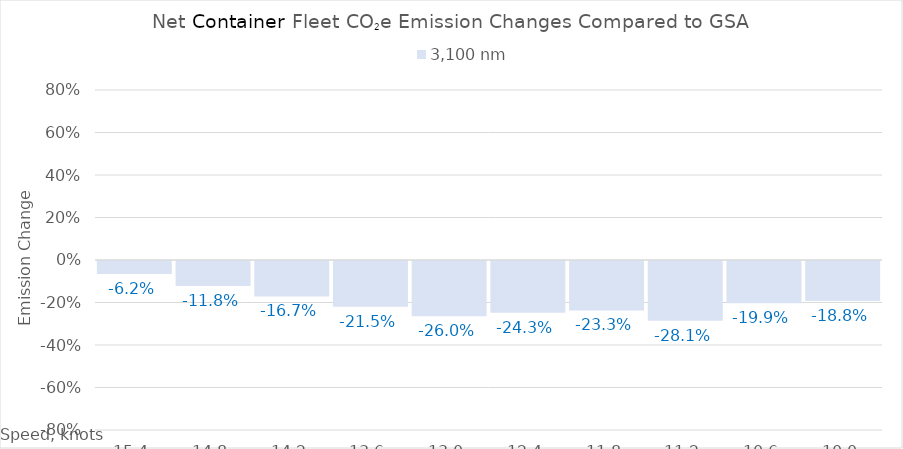
| Category | 3,100 |
|---|---|
| 15.4 | -0.062 |
| 14.8 | -0.118 |
| 14.200000000000001 | -0.167 |
| 13.600000000000001 | -0.215 |
| 13.000000000000002 | -0.26 |
| 12.400000000000002 | -0.243 |
| 11.800000000000002 | -0.233 |
| 11.200000000000003 | -0.281 |
| 10.600000000000003 | -0.199 |
| 10.000000000000004 | -0.188 |